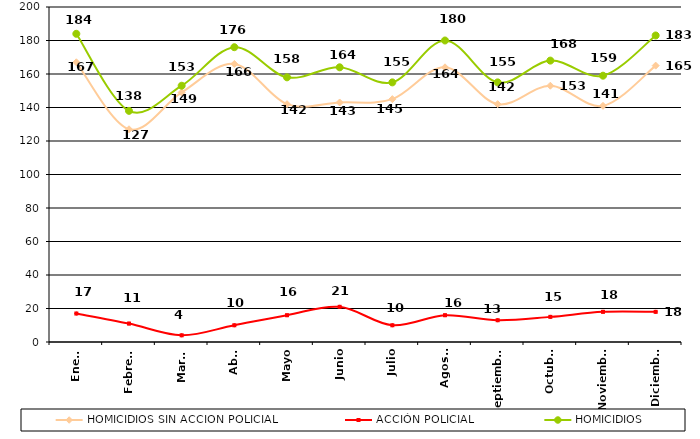
| Category | HOMICIDIOS SIN ACCION POLICIAL | ACCIÓN POLICIAL | HOMICIDIOS |
|---|---|---|---|
| Enero | 167 | 17 | 184 |
| Febrero | 127 | 11 | 138 |
| Marzo | 149 | 4 | 153 |
| Abril | 166 | 10 | 176 |
| Mayo | 142 | 16 | 158 |
| Junio | 143 | 21 | 164 |
| Julio | 145 | 10 | 155 |
| Agosto | 164 | 16 | 180 |
| Septiembre | 142 | 13 | 155 |
| Octubre | 153 | 15 | 168 |
| Noviembre | 141 | 18 | 159 |
| Diciembre | 165 | 18 | 183 |